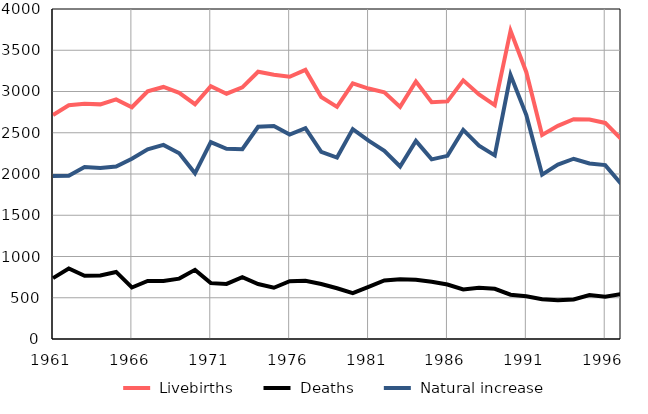
| Category |  Livebirths |  Deaths |  Natural increase |
|---|---|---|---|
| 1961.0 | 2715 | 738 | 1977 |
| 1962.0 | 2834 | 854 | 1980 |
| 1963.0 | 2850 | 766 | 2084 |
| 1964.0 | 2844 | 770 | 2074 |
| 1965.0 | 2904 | 813 | 2091 |
| 1966.0 | 2809 | 624 | 2185 |
| 1967.0 | 3003 | 703 | 2300 |
| 1968.0 | 3055 | 702 | 2353 |
| 1969.0 | 2983 | 732 | 2251 |
| 1970.0 | 2846 | 838 | 2008 |
| 1971.0 | 3063 | 677 | 2386 |
| 1972.0 | 2973 | 668 | 2305 |
| 1973.0 | 3050 | 749 | 2301 |
| 1974.0 | 3239 | 667 | 2572 |
| 1975.0 | 3203 | 621 | 2582 |
| 1976.0 | 3179 | 701 | 2478 |
| 1977.0 | 3262 | 707 | 2555 |
| 1978.0 | 2934 | 666 | 2268 |
| 1979.0 | 2814 | 615 | 2199 |
| 1980.0 | 3099 | 555 | 2544 |
| 1981.0 | 3036 | 631 | 2405 |
| 1982.0 | 2991 | 709 | 2282 |
| 1983.0 | 2814 | 723 | 2091 |
| 1984.0 | 3121 | 719 | 2402 |
| 1985.0 | 2870 | 693 | 2177 |
| 1986.0 | 2880 | 660 | 2220 |
| 1987.0 | 3135 | 601 | 2534 |
| 1988.0 | 2965 | 621 | 2344 |
| 1989.0 | 2834 | 608 | 2226 |
| 1990.0 | 3737 | 537 | 3200 |
| 1991.0 | 3234 | 519 | 2715 |
| 1992.0 | 2474 | 481 | 1993 |
| 1993.0 | 2584 | 470 | 2114 |
| 1994.0 | 2665 | 480 | 2185 |
| 1995.0 | 2660 | 533 | 2127 |
| 1996.0 | 2619 | 511 | 2108 |
| 1997.0 | 2426 | 545 | 1881 |